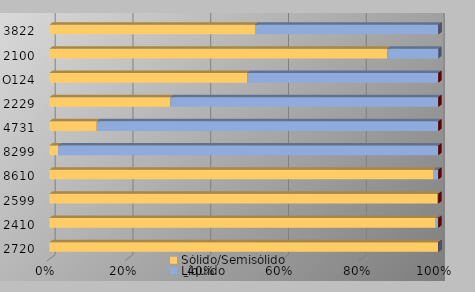
| Category | Sólido/Semisólido  | Líquido | Gaseoso |
|---|---|---|---|
| 2720 | 4638777.6 | 0 | 0 |
| 2410 | 3338333.44 | 21220 | 0 |
| 2599 | 1254278.25 | 2510.7 | 0 |
| 8610 | 1074115.27 | 12724 | 0 |
| 8299 | 20339 | 890119 | 0 |
| 4731 | 94152.3 | 677888.87 | 0 |
| 2229 | 154418.5 | 341777.63 | 0 |
| O124 | 233188.16 | 225571.2 | 0 |
| 2100 | 374863.48 | 56839.6 | 0 |
| 3822 | 217770.4 | 194244.4 | 0 |